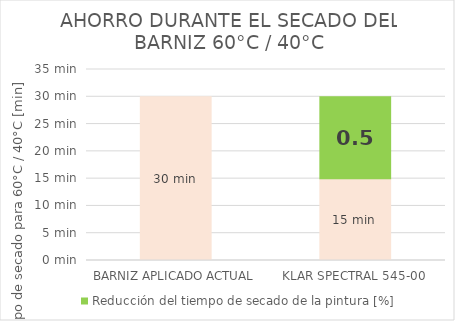
| Category | Tiempo de secado para 60°C / 40°C [min] | Reducción del tiempo de secado de la pintura [%] |
|---|---|---|
| BARNIZ APLICADO ACTUAL | 30 | 0 |
| KLAR SPECTRAL 545-00 | 15 | 15 |